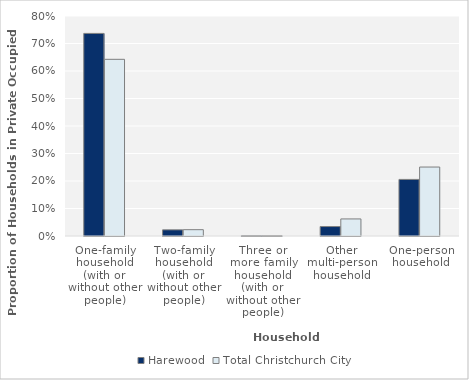
| Category | Harewood | Total Christchurch City |
|---|---|---|
| One-family household (with or without other people) | 0.737 |  |
| Two-family household (with or without other people) | 0.022 |  |
| Three or more family household (with or without other people) | 0.001 |  |
| Other multi-person household | 0.034 |  |
| One-person household | 0.206 |  |